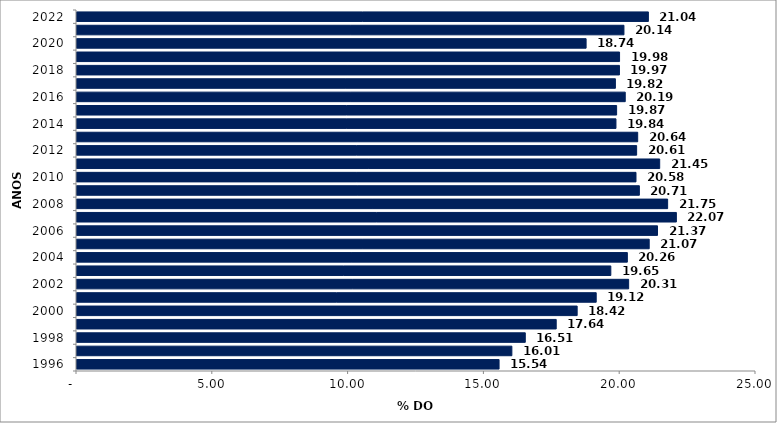
| Category | Series 0 |
|---|---|
| 1996 | 15.54 |
| 1997 | 16.011 |
| 1998 | 16.505 |
| 1999 | 17.644 |
| 2000 | 18.415 |
| 2001 | 19.117 |
| 2002 | 20.311 |
| 2003 | 19.654 |
| 2004 | 20.264 |
| 2005 | 21.068 |
| 2006 | 21.374 |
| 2007 | 22.069 |
| 2008 | 21.746 |
| 2009 | 20.706 |
| 2010 | 20.581 |
| 2011 | 21.454 |
| 2012 | 20.605 |
| 2013 | 20.644 |
| 2014 | 19.844 |
| 2015 | 19.868 |
| 2016 | 20.186 |
| 2017 | 19.823 |
| 2018 | 19.972 |
| 2019 | 19.976 |
| 2020 | 18.745 |
| 2021 | 20.138 |
| 2022 | 21.038 |